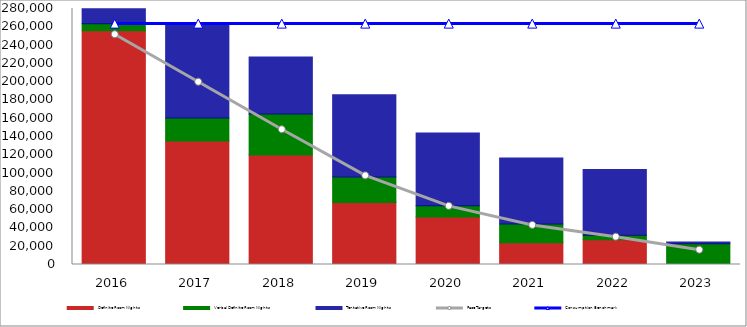
| Category | Definite Room Nights | Verbal Definite Room Nights | Tentative Room Nights |
|---|---|---|---|
| 2016.0 | 255592 | 7649 | 16595 |
| 2017.0 | 135162 | 25177 | 101918 |
| 2018.0 | 119738 | 44777 | 62534 |
| 2019.0 | 67679 | 28119 | 89882 |
| 2020.0 | 52056 | 12090 | 79725 |
| 2021.0 | 23925 | 20387 | 72207 |
| 2022.0 | 27014 | 5000 | 72004 |
| 2023.0 | 0 | 22743 | 1750 |